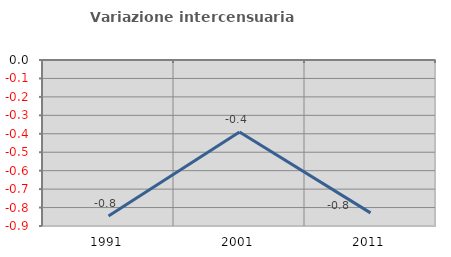
| Category | Variazione intercensuaria annua |
|---|---|
| 1991.0 | -0.846 |
| 2001.0 | -0.391 |
| 2011.0 | -0.829 |